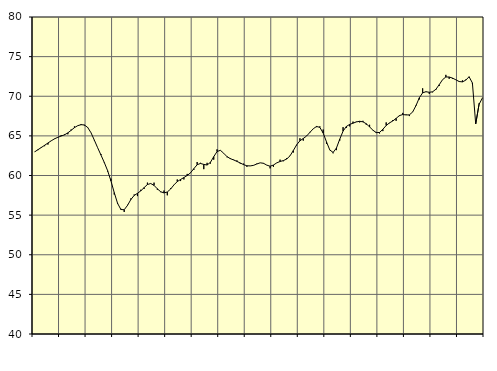
| Category | Piggar | Samtliga anställda (inkl. anställda utomlands) |
|---|---|---|
| nan | 63 | 62.98 |
| 87.0 | 63.2 | 63.26 |
| 87.0 | 63.6 | 63.53 |
| 87.0 | 63.7 | 63.81 |
| nan | 63.9 | 64.1 |
| 88.0 | 64.4 | 64.38 |
| 88.0 | 64.6 | 64.63 |
| 88.0 | 64.8 | 64.82 |
| nan | 65.1 | 64.98 |
| 89.0 | 65.2 | 65.13 |
| 89.0 | 65.2 | 65.38 |
| 89.0 | 65.8 | 65.7 |
| nan | 66.2 | 66.04 |
| 90.0 | 66.3 | 66.29 |
| 90.0 | 66.5 | 66.41 |
| 90.0 | 66.3 | 66.38 |
| nan | 66.1 | 66.06 |
| 91.0 | 65.4 | 65.39 |
| 91.0 | 64.4 | 64.46 |
| 91.0 | 63.5 | 63.5 |
| nan | 62.7 | 62.58 |
| 92.0 | 61.7 | 61.64 |
| 92.0 | 60.5 | 60.61 |
| 92.0 | 59.6 | 59.32 |
| nan | 57.6 | 57.84 |
| 93.0 | 56.4 | 56.49 |
| 93.0 | 55.8 | 55.71 |
| 93.0 | 55.4 | 55.68 |
| nan | 56.3 | 56.23 |
| 94.0 | 57.1 | 56.96 |
| 94.0 | 57.6 | 57.48 |
| 94.0 | 57.4 | 57.75 |
| nan | 58.2 | 58.06 |
| 95.0 | 58.3 | 58.47 |
| 95.0 | 59.1 | 58.86 |
| 95.0 | 59 | 58.99 |
| nan | 59.1 | 58.75 |
| 96.0 | 58.2 | 58.32 |
| 96.0 | 57.9 | 57.95 |
| 96.0 | 58.1 | 57.8 |
| nan | 57.5 | 57.92 |
| 97.0 | 58.4 | 58.29 |
| 97.0 | 58.8 | 58.81 |
| 97.0 | 59.5 | 59.23 |
| nan | 59.3 | 59.5 |
| 98.0 | 59.5 | 59.74 |
| 98.0 | 60.2 | 60 |
| 98.0 | 60.3 | 60.34 |
| nan | 60.7 | 60.86 |
| 99.0 | 61.7 | 61.36 |
| 99.0 | 61.6 | 61.52 |
| 99.0 | 60.8 | 61.4 |
| nan | 61.6 | 61.32 |
| 0.0 | 61.5 | 61.66 |
| 0.0 | 62 | 62.37 |
| 0.0 | 63.3 | 63.02 |
| nan | 63.2 | 63.18 |
| 1.0 | 62.8 | 62.81 |
| 1.0 | 62.3 | 62.38 |
| 1.0 | 62.2 | 62.13 |
| nan | 62 | 61.96 |
| 2.0 | 61.9 | 61.78 |
| 2.0 | 61.5 | 61.58 |
| 2.0 | 61.5 | 61.37 |
| nan | 61.1 | 61.23 |
| 3.0 | 61.2 | 61.21 |
| 3.0 | 61.3 | 61.28 |
| 3.0 | 61.5 | 61.45 |
| nan | 61.6 | 61.6 |
| 4.0 | 61.5 | 61.54 |
| 4.0 | 61.3 | 61.31 |
| 4.0 | 60.9 | 61.17 |
| nan | 61.1 | 61.32 |
| 5.0 | 61.6 | 61.59 |
| 5.0 | 62 | 61.77 |
| 5.0 | 61.8 | 61.88 |
| nan | 62.2 | 62.08 |
| 6.0 | 62.5 | 62.48 |
| 6.0 | 62.9 | 63.15 |
| 6.0 | 63.8 | 63.87 |
| nan | 64.7 | 64.38 |
| 7.0 | 64.4 | 64.67 |
| 7.0 | 65 | 64.98 |
| 7.0 | 65.5 | 65.44 |
| nan | 65.9 | 65.89 |
| 8.0 | 66.1 | 66.19 |
| 8.0 | 66.2 | 66.07 |
| 8.0 | 65.8 | 65.36 |
| nan | 64 | 64.25 |
| 9.0 | 63.2 | 63.22 |
| 9.0 | 62.8 | 62.91 |
| 9.0 | 63.2 | 63.46 |
| nan | 64.4 | 64.58 |
| 10.0 | 66.1 | 65.6 |
| 10.0 | 66 | 66.19 |
| 10.0 | 66.2 | 66.45 |
| nan | 66.8 | 66.6 |
| 11.0 | 66.8 | 66.76 |
| 11.0 | 66.7 | 66.84 |
| 11.0 | 66.9 | 66.77 |
| nan | 66.4 | 66.53 |
| 12.0 | 66.4 | 66.13 |
| 12.0 | 65.7 | 65.72 |
| 12.0 | 65.5 | 65.41 |
| nan | 65.3 | 65.43 |
| 13.0 | 65.6 | 65.83 |
| 13.0 | 66.7 | 66.31 |
| 13.0 | 66.6 | 66.64 |
| nan | 67 | 66.88 |
| 14.0 | 66.9 | 67.21 |
| 14.0 | 67.5 | 67.56 |
| 14.0 | 67.9 | 67.69 |
| nan | 67.7 | 67.64 |
| 15.0 | 67.5 | 67.65 |
| 15.0 | 68 | 68.02 |
| 15.0 | 68.9 | 68.83 |
| nan | 69.6 | 69.81 |
| 16.0 | 71 | 70.43 |
| 16.0 | 70.6 | 70.57 |
| 16.0 | 70.3 | 70.5 |
| nan | 70.5 | 70.56 |
| 17.0 | 70.8 | 70.88 |
| 17.0 | 71.3 | 71.46 |
| 17.0 | 72.1 | 72.09 |
| nan | 72.7 | 72.43 |
| 18.0 | 72.2 | 72.43 |
| 18.0 | 72.2 | 72.29 |
| 18.0 | 72.1 | 72.08 |
| nan | 71.9 | 71.86 |
| 19.0 | 72 | 71.81 |
| 19.0 | 72.1 | 72.03 |
| 19.0 | 72.4 | 72.46 |
| nan | 71.6 | 71.68 |
| 20.0 | 66.5 | 66.51 |
| 20.0 | 69.1 | 68.96 |
| 20.0 | 69.8 | 69.77 |